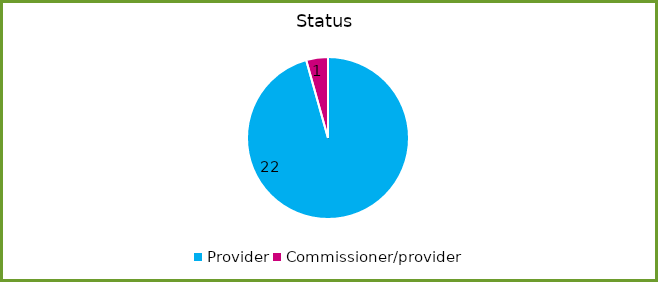
| Category | Series 0 |
|---|---|
| Provider | 22 |
| Commissioner/provider | 1 |